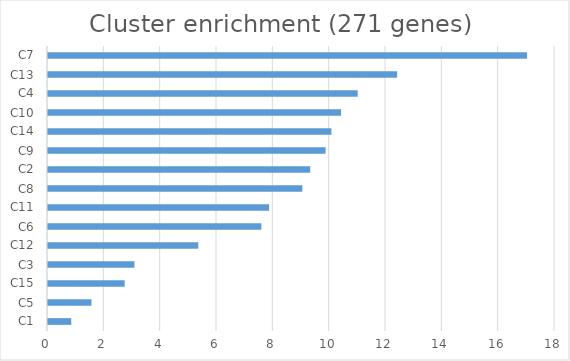
| Category | minus log10(q) |
|---|---|
| C1 | 0.825 |
| C5 | 1.543 |
| C15 | 2.721 |
| C3 | 3.069 |
| C12 | 5.338 |
| C6 | 7.575 |
| C11 | 7.849 |
| C8 | 9.03 |
| C2 | 9.31 |
| C9 | 9.855 |
| C14 | 10.061 |
| C10 | 10.405 |
| C4 | 10.996 |
| C13 | 12.396 |
| C7 | 17.007 |